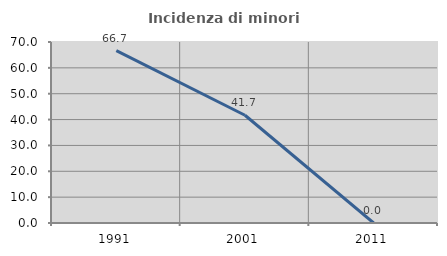
| Category | Incidenza di minori stranieri |
|---|---|
| 1991.0 | 66.667 |
| 2001.0 | 41.667 |
| 2011.0 | 0 |